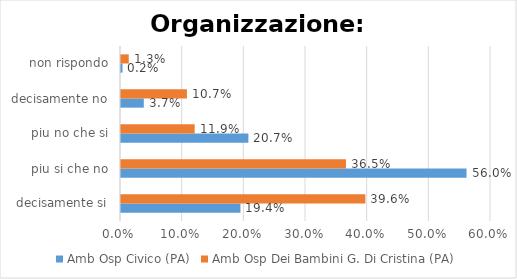
| Category | Amb Osp Civico (PA) | Amb Osp Dei Bambini G. Di Cristina (PA) |
|---|---|---|
| decisamente si | 0.194 | 0.396 |
| piu si che no | 0.56 | 0.365 |
| piu no che si | 0.207 | 0.119 |
| decisamente no | 0.037 | 0.107 |
| non rispondo | 0.002 | 0.013 |